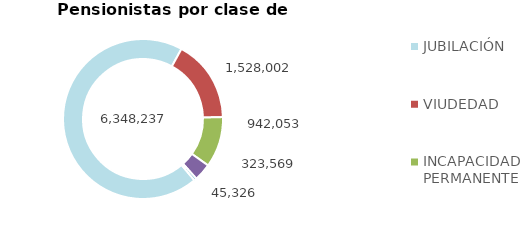
| Category | Series 0 |
|---|---|
| JUBILACIÓN | 6348237 |
| VIUDEDAD | 1528002 |
| INCAPACIDAD PERMANENTE | 942053 |
| ORFANDAD | 323569 |
| FAVOR DE FAMILIARES | 45326 |